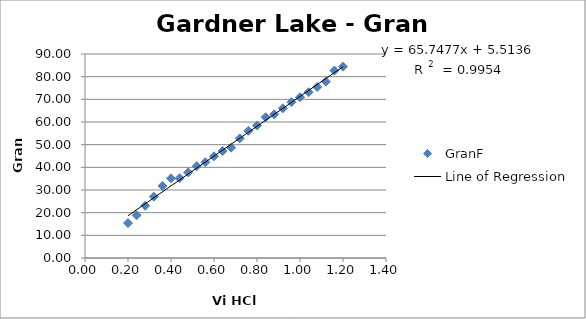
| Category | GranF |
|---|---|
| 0.2 | 15.425 |
| 0.24 | 18.856 |
| 0.28 | 23.049 |
| 0.32 | 27.069 |
| 0.36 | 31.791 |
| 0.4 | 35.163 |
| 0.44 | 35.191 |
| 0.48 | 37.772 |
| 0.52 | 40.543 |
| 0.56 | 42.231 |
| 0.6 | 44.878 |
| 0.64 | 47.216 |
| 0.68 | 48.693 |
| 0.72 | 52.79 |
| 0.76 | 56.098 |
| 0.8 | 58.434 |
| 0.84 | 62.096 |
| 0.88 | 63.4 |
| 0.92 | 66.04 |
| 0.96 | 68.789 |
| 1.0 | 70.939 |
| 1.04 | 73.157 |
| 1.08 | 75.444 |
| 1.12 | 77.803 |
| 1.16 | 82.678 |
| 1.2 | 84.415 |